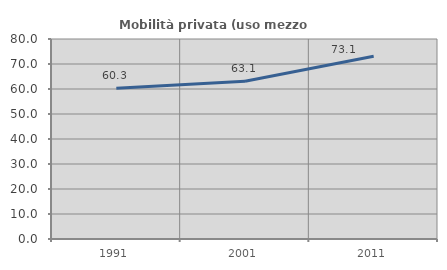
| Category | Mobilità privata (uso mezzo privato) |
|---|---|
| 1991.0 | 60.292 |
| 2001.0 | 63.069 |
| 2011.0 | 73.103 |